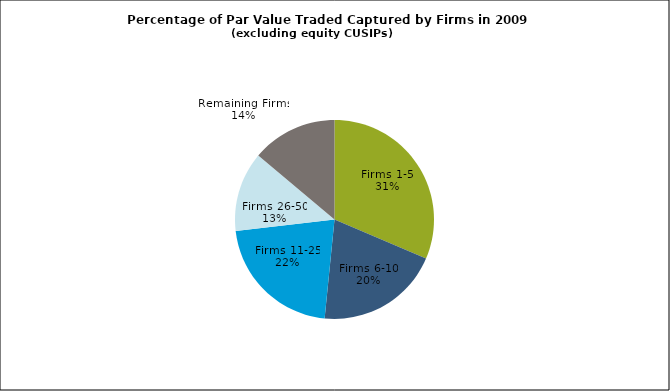
| Category | Series 0 |
|---|---|
| Firms 1-5 | 0.314 |
| Firms 6-10 | 0.202 |
| Firms 11-25 | 0.216 |
| Firms 26-50 | 0.129 |
| Remaining Firms | 0.139 |